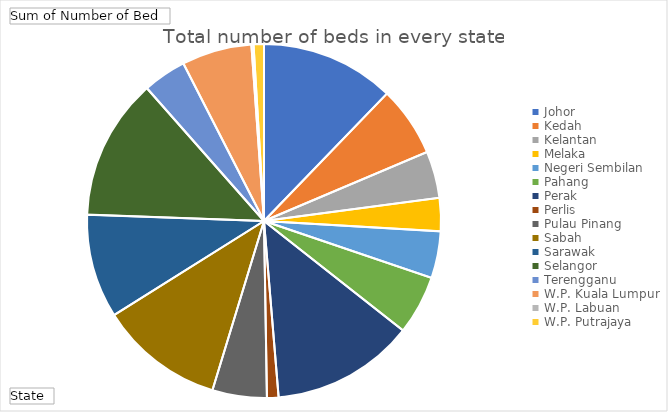
| Category | Total |
|---|---|
| Johor | 15338 |
| Kedah | 8045 |
| Kelantan | 5372 |
| Melaka | 3797 |
| Negeri Sembilan | 5374 |
| Pahang | 6786 |
| Perak | 16405 |
| Perlis | 1324 |
| Pulau Pinang | 6241 |
| Sabah | 14283 |
| Sarawak | 11911 |
| Selangor | 16231 |
| Terengganu | 4986 |
| W.P. Kuala Lumpur | 8023 |
| W.P. Labuan | 244 |
| W.P. Putrajaya | 1186 |